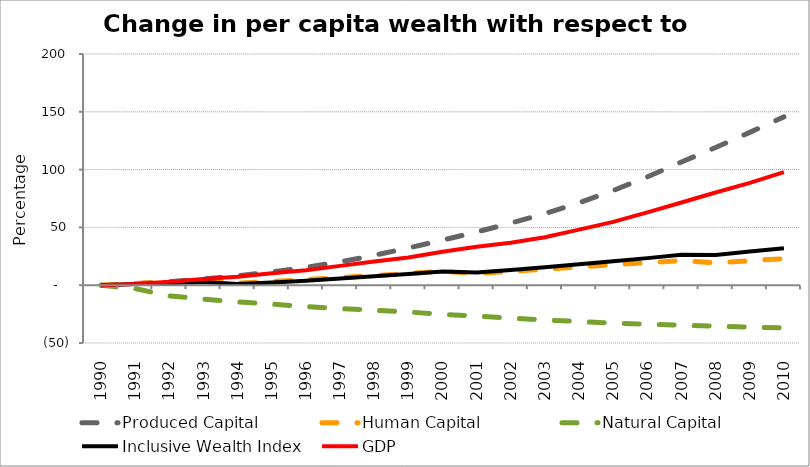
| Category | Produced Capital  | Human Capital | Natural Capital | Inclusive Wealth Index | GDP |
|---|---|---|---|---|---|
| 1990.0 | 0 | 0 | 0 | 0 | 0 |
| 1991.0 | 1.242 | 1.45 | -2.889 | 1.022 | 0.989 |
| 1992.0 | 3.015 | 2.788 | -9.269 | 1.696 | 2.912 |
| 1993.0 | 5.332 | 4.18 | -11.957 | 2.819 | 5.308 |
| 1994.0 | 8.164 | 1.698 | -14.461 | 0.972 | 7.31 |
| 1995.0 | 11.485 | 3.128 | -16.376 | 2.318 | 10.268 |
| 1996.0 | 15.458 | 4.846 | -18.526 | 3.947 | 13.016 |
| 1997.0 | 20.181 | 6.597 | -20.194 | 5.736 | 16.729 |
| 1998.0 | 25.818 | 8.375 | -21.657 | 7.676 | 20.436 |
| 1999.0 | 32.18 | 10.175 | -23.137 | 9.717 | 23.906 |
| 2000.0 | 38.976 | 11.988 | -25.162 | 11.77 | 28.864 |
| 2001.0 | 46.01 | 10.03 | -26.753 | 10.923 | 33.241 |
| 2002.0 | 53.658 | 11.908 | -28.514 | 13.155 | 36.719 |
| 2003.0 | 61.965 | 13.827 | -30.085 | 15.514 | 41.534 |
| 2004.0 | 71.258 | 15.795 | -31.469 | 18.048 | 48.111 |
| 2005.0 | 81.932 | 17.818 | -32.772 | 20.799 | 54.75 |
| 2006.0 | 93.676 | 19.488 | -33.767 | 23.428 | 62.962 |
| 2007.0 | 106.582 | 21.252 | -34.606 | 26.284 | 71.505 |
| 2008.0 | 119.138 | 19.264 | -35.404 | 26.149 | 80.217 |
| 2009.0 | 132.204 | 21.11 | -36.192 | 29.093 | 88.553 |
| 2010.0 | 145.598 | 22.931 | -37.006 | 32.056 | 97.761 |